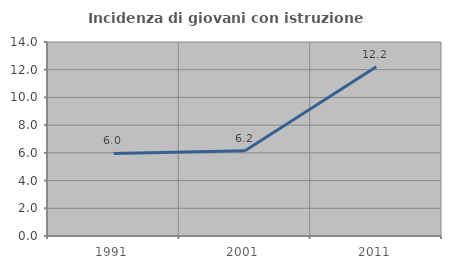
| Category | Incidenza di giovani con istruzione universitaria |
|---|---|
| 1991.0 | 5.956 |
| 2001.0 | 6.152 |
| 2011.0 | 12.217 |